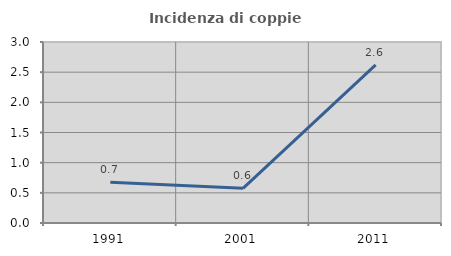
| Category | Incidenza di coppie miste |
|---|---|
| 1991.0 | 0.675 |
| 2001.0 | 0.575 |
| 2011.0 | 2.62 |